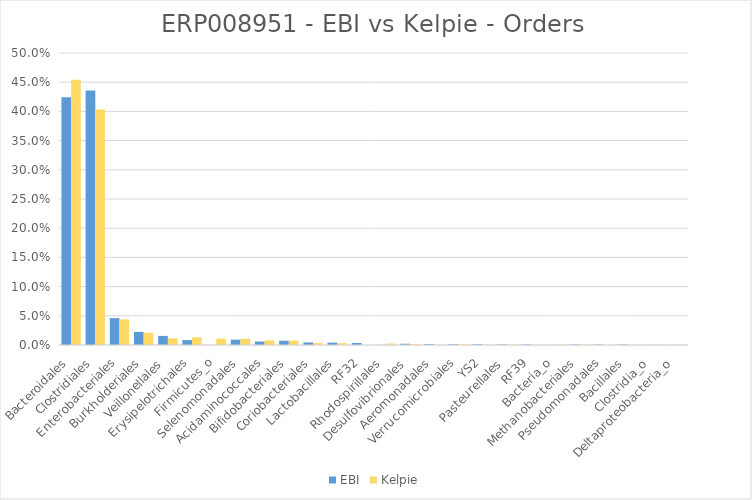
| Category | EBI | Kelpie |
|---|---|---|
| Bacteroidales | 0.424 | 0.454 |
| Clostridiales | 0.436 | 0.403 |
| Enterobacteriales | 0.046 | 0.044 |
| Burkholderiales | 0.022 | 0.021 |
| Veillonellales | 0.016 | 0.012 |
| Erysipelotrichales | 0.008 | 0.013 |
| Firmicutes_o | 0 | 0.011 |
| Selenomonadales | 0.009 | 0.011 |
| Acidaminococcales | 0.006 | 0.008 |
| Bifidobacteriales | 0.007 | 0.007 |
| Coriobacteriales | 0.004 | 0.003 |
| Lactobacillales | 0.004 | 0.003 |
| RF32 | 0.003 | 0 |
| Rhodospirillales | 0 | 0.003 |
| Desulfovibrionales | 0.002 | 0.002 |
| Aeromonadales | 0.001 | 0 |
| Verrucomicrobiales | 0.001 | 0.001 |
| YS2 | 0.001 | 0 |
| Pasteurellales | 0.001 | 0 |
| RF39 | 0.001 | 0 |
| Bacteria_o | 0 | 0.001 |
| Methanobacteriales | 0.001 | 0.001 |
| Pseudomonadales | 0.001 | 0 |
| Bacillales | 0.001 | 0 |
| Clostridia_o | 0 | 0.001 |
| Deltaproteobacteria_o | 0 | 0.001 |